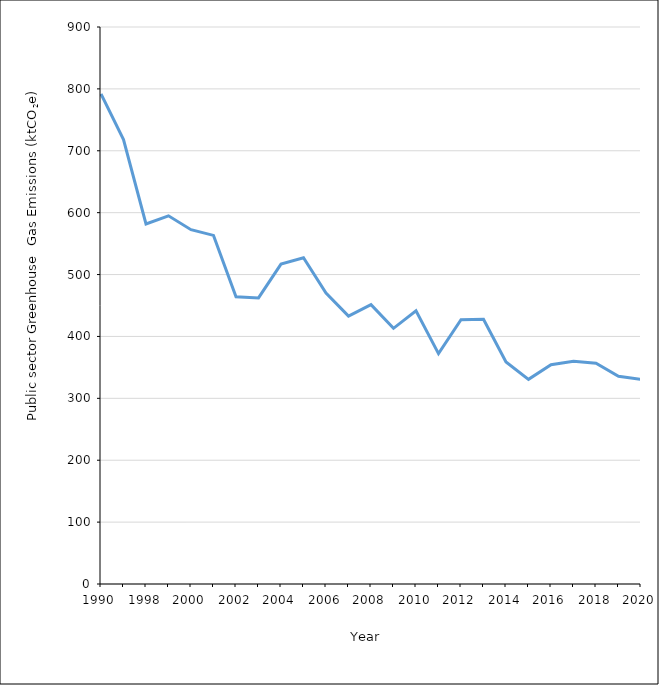
| Category | Public Sector Total (ktCO2e) |
|---|---|
| 1990 | 791.774 |
| 1995 | 718.202 |
| 1998 | 581.716 |
| 1999 | 594.958 |
| 2000 | 572.517 |
| 2001 | 563.274 |
| 2002 | 464.006 |
| 2003 | 462.246 |
| 2004 | 516.948 |
| 2005 | 527.115 |
| 2006 | 470.125 |
| 2007 | 432.861 |
| 2008 | 451.362 |
| 2009 | 413.097 |
| 2010 | 441.4 |
| 2011 | 372.197 |
| 2012 | 427.08 |
| 2013 | 427.641 |
| 2014 | 358.69 |
| 2015 | 330.695 |
| 2016 | 354.31 |
| 2017 | 359.735 |
| 2018 | 356.707 |
| 2019 | 335.738 |
| 2020 | 330.693 |